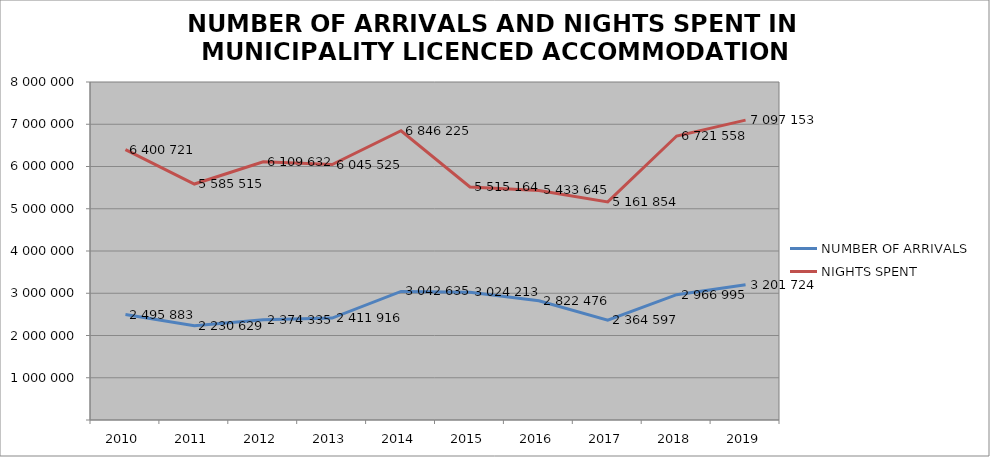
| Category | NUMBER OF ARRIVALS | NIGHTS SPENT |
|---|---|---|
| 2010 | 2495883 | 6400721 |
| 2011 | 2230629 | 5585515 |
| 2012 | 2374335 | 6109632 |
| 2013 | 2411916 | 6045525 |
| 2014 | 3042635 | 6846225 |
| 2015 | 3024213 | 5515164 |
| 2016 | 2822476 | 5433645 |
| 2017 | 2364597 | 5161854 |
| 2018 | 2966995 | 6721558 |
| 2019 | 3201724 | 7097153 |